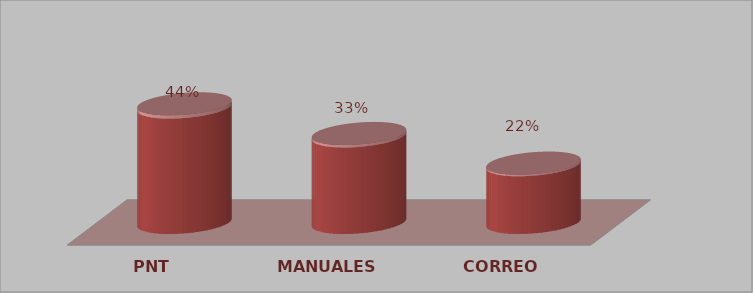
| Category | Series 0 | Series 1 |
|---|---|---|
| PNT | 16 | 0.444 |
| MANUALES | 12 | 0.333 |
| CORREO | 8 | 0.222 |